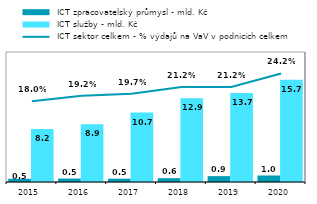
| Category |  ICT zpracovatelský průmysl - mld. Kč |  ICT služby - mld. Kč |
|---|---|---|
| 2015.0 | 0.5 | 8.162 |
| 2016.0 | 0.532 | 8.889 |
| 2017.0 | 0.512 | 10.677 |
| 2018.0 | 0.591 | 12.903 |
| 2019.0 | 0.902 | 13.698 |
| 2020.0 | 0.999 | 15.74 |